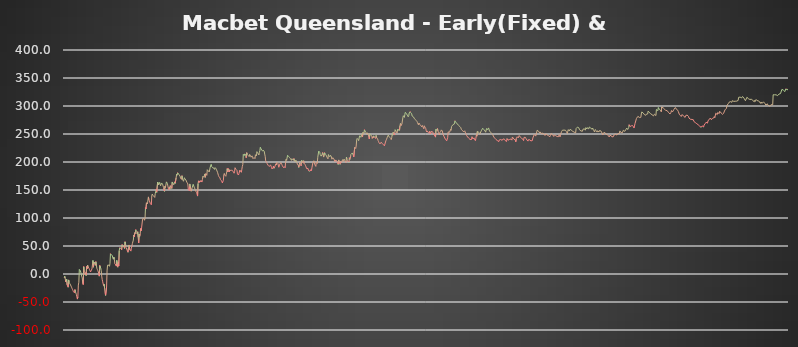
| Category | Series 0 |
|---|---|
| 0 | -7 |
| 1 | -4 |
| 2 | -8 |
| 3 | -14 |
| 4 | -15 |
| 5 | -9.6 |
| 6 | -19.6 |
| 7 | -21.6 |
| 8 | -23.6 |
| 9 | -10.6 |
| 10 | -14.6 |
| 11 | -16.6 |
| 12 | -17.6 |
| 13 | -19.6 |
| 14 | -21.6 |
| 15 | -23.6 |
| 16 | -25.6 |
| 17 | -27.6 |
| 18 | -29.6 |
| 19 | -31.6 |
| 20 | -32.6 |
| 21 | -33.6 |
| 22 | -27.8 |
| 23 | -31.8 |
| 24 | -32.8 |
| 25 | -36.8 |
| 26 | -40.8 |
| 27 | -44.8 |
| 28 | -41.2 |
| 29 | -19.84 |
| 30 | -14.84 |
| 31 | 8.16 |
| 32 | 7.16 |
| 33 | 6.16 |
| 34 | 5.16 |
| 35 | 0.16 |
| 36 | -4.84 |
| 37 | -6.84 |
| 38 | -16.84 |
| 39 | -18.84 |
| 40 | 13.16 |
| 41 | 3.16 |
| 42 | 1.16 |
| 43 | -0.84 |
| 44 | 2.36 |
| 45 | -2.64 |
| 46 | 13.36 |
| 47 | 9.36 |
| 48 | 15.76 |
| 49 | 12.76 |
| 50 | 11.76 |
| 51 | 9.76 |
| 52 | 7.76 |
| 53 | 5.76 |
| 54 | 3.76 |
| 55 | 2.76 |
| 56 | 4.56 |
| 57 | 9.16 |
| 58 | 8.16 |
| 59 | 24.16 |
| 60 | 12.16 |
| 61 | 21.36 |
| 62 | 19.36 |
| 63 | 17.36 |
| 64 | 15.36 |
| 65 | 22.16 |
| 66 | 16.16 |
| 67 | 10.16 |
| 68 | 8.16 |
| 69 | 6.16 |
| 70 | 5.16 |
| 71 | 1.16 |
| 72 | -3.84 |
| 73 | 15.16 |
| 74 | 14.16 |
| 75 | 10.16 |
| 76 | 6.16 |
| 77 | -3.84 |
| 78 | -9.84 |
| 79 | -13.84 |
| 80 | -14.84 |
| 81 | -20.84 |
| 82 | -18.24 |
| 83 | -26.24 |
| 84 | -34.24 |
| 85 | -38.24 |
| 86 | -39.24 |
| 87 | -23.24 |
| 88 | 5.56 |
| 89 | 15.76 |
| 90 | 14.76 |
| 91 | 16.76 |
| 92 | 15.76 |
| 93 | 13.76 |
| 94 | 18.76 |
| 95 | 36.36 |
| 96 | 35.36 |
| 97 | 34.36 |
| 98 | 33.36 |
| 99 | 32.36 |
| 100 | 28.36 |
| 101 | 26.36 |
| 102 | 30.16 |
| 103 | 26.16 |
| 104 | 18.16 |
| 105 | 17.16 |
| 106 | 16.16 |
| 107 | 14.16 |
| 108 | 24.16 |
| 109 | 14.16 |
| 110 | 12.16 |
| 111 | 20.56 |
| 112 | 14.56 |
| 113 | 41.56 |
| 114 | 47.06 |
| 115 | 48.36 |
| 116 | 47.36 |
| 117 | 45.36 |
| 118 | 43.36 |
| 119 | 52.56 |
| 120 | 51.56 |
| 121 | 50.56 |
| 122 | 49.56 |
| 123 | 47.56 |
| 124 | 45.56 |
| 125 | 57.56 |
| 126 | 53.56 |
| 127 | 47.56 |
| 128 | 46.56 |
| 129 | 48.86 |
| 130 | 40.86 |
| 131 | 38.86 |
| 132 | 46.86 |
| 133 | 51.86 |
| 134 | 50.86 |
| 135 | 42.86 |
| 136 | 41.86 |
| 137 | 40.86 |
| 138 | 45.86 |
| 139 | 47.11 |
| 140 | 54.31 |
| 141 | 53.31 |
| 142 | 60.51 |
| 143 | 69.71 |
| 144 | 66.71 |
| 145 | 73.91 |
| 146 | 71.91 |
| 147 | 79.41 |
| 148 | 77.41 |
| 149 | 75.41 |
| 150 | 71.41 |
| 151 | 75.41 |
| 152 | 65.41 |
| 153 | 55.41 |
| 154 | 71.41 |
| 155 | 67.41 |
| 156 | 70.81 |
| 157 | 81.21 |
| 158 | 77.21 |
| 159 | 82.96 |
| 160 | 81.96 |
| 161 | 97.96 |
| 162 | 96.96 |
| 163 | 99.96 |
| 164 | 98.96 |
| 165 | 95.96 |
| 166 | 99.16 |
| 167 | 118.36 |
| 168 | 116.36 |
| 169 | 127.16 |
| 170 | 126.16 |
| 171 | 125.16 |
| 172 | 124.16 |
| 173 | 137.66 |
| 174 | 132.66 |
| 175 | 130.66 |
| 176 | 129.66 |
| 177 | 125.66 |
| 178 | 124.66 |
| 179 | 123.66 |
| 180 | 140.66 |
| 181 | 142.76 |
| 182 | 140.76 |
| 183 | 139.76 |
| 184 | 138.76 |
| 185 | 137.76 |
| 186 | 136.76 |
| 187 | 143.36 |
| 188 | 142.36 |
| 189 | 150.86 |
| 190 | 145.86 |
| 191 | 144.86 |
| 192 | 164.06 |
| 193 | 163.06 |
| 194 | 159.06 |
| 195 | 158.06 |
| 196 | 163.56 |
| 197 | 162.56 |
| 198 | 157.56 |
| 199 | 156.56 |
| 200 | 162.56 |
| 201 | 161.56 |
| 202 | 160.56 |
| 203 | 159.56 |
| 204 | 154.56 |
| 205 | 149.56 |
| 206 | 147.56 |
| 207 | 156.56 |
| 208 | 154.56 |
| 209 | 155.76 |
| 210 | 164.56 |
| 211 | 163.56 |
| 212 | 161.56 |
| 213 | 160.56 |
| 214 | 152.56 |
| 215 | 150.56 |
| 216 | 155.36 |
| 217 | 151.36 |
| 218 | 157.76 |
| 219 | 156.76 |
| 220 | 154.76 |
| 221 | 152.76 |
| 222 | 164.36 |
| 223 | 163.36 |
| 224 | 161.36 |
| 225 | 159.36 |
| 226 | 158.36 |
| 227 | 164.76 |
| 228 | 161.76 |
| 229 | 160.76 |
| 230 | 171.96 |
| 231 | 178.36 |
| 232 | 176.36 |
| 233 | 181 |
| 234 | 180 |
| 235 | 179 |
| 236 | 177 |
| 237 | 176 |
| 238 | 175 |
| 239 | 171 |
| 240 | 170 |
| 241 | 169 |
| 242 | 175.6 |
| 243 | 169.6 |
| 244 | 167.6 |
| 245 | 165.6 |
| 246 | 164.6 |
| 247 | 171.85 |
| 248 | 169.85 |
| 249 | 168.85 |
| 250 | 167.85 |
| 251 | 166.85 |
| 252 | 163.85 |
| 253 | 162.85 |
| 254 | 160.85 |
| 255 | 150.85 |
| 256 | 149.85 |
| 257 | 148.85 |
| 258 | 160.85 |
| 259 | 159.85 |
| 260 | 151.85 |
| 261 | 147.85 |
| 262 | 151.45 |
| 263 | 154.15 |
| 264 | 153.15 |
| 265 | 160.15 |
| 266 | 159.15 |
| 267 | 155.15 |
| 268 | 154.15 |
| 269 | 151.15 |
| 270 | 148.15 |
| 271 | 147.15 |
| 272 | 146.15 |
| 273 | 145.15 |
| 274 | 139.15 |
| 275 | 161.15 |
| 276 | 166.35 |
| 277 | 163.35 |
| 278 | 166.2 |
| 279 | 164.2 |
| 280 | 163.2 |
| 281 | 167.2 |
| 282 | 166.2 |
| 283 | 164.2 |
| 284 | 168.7 |
| 285 | 174.7 |
| 286 | 173.7 |
| 287 | 172.7 |
| 288 | 171.7 |
| 289 | 178.7 |
| 290 | 172.7 |
| 291 | 179.2 |
| 292 | 178.2 |
| 293 | 176.2 |
| 294 | 186.2 |
| 295 | 185.2 |
| 296 | 184.2 |
| 297 | 183.2 |
| 298 | 182.2 |
| 299 | 181.2 |
| 300 | 190.8 |
| 301 | 189.8 |
| 302 | 195.8 |
| 303 | 191.8 |
| 304 | 190.8 |
| 305 | 189.8 |
| 306 | 190.75 |
| 307 | 189.75 |
| 308 | 188.75 |
| 309 | 186.75 |
| 310 | 189.95 |
| 311 | 188.95 |
| 312 | 187.95 |
| 313 | 185.95 |
| 314 | 187.73 |
| 315 | 181.73 |
| 316 | 180.73 |
| 317 | 175.73 |
| 318 | 173.73 |
| 319 | 172.73 |
| 320 | 171.73 |
| 321 | 168.73 |
| 322 | 167.73 |
| 323 | 166.73 |
| 324 | 164.73 |
| 325 | 162.73 |
| 326 | 161.73 |
| 327 | 167.23 |
| 328 | 177.23 |
| 329 | 179.53 |
| 330 | 176.53 |
| 331 | 175.53 |
| 332 | 174.53 |
| 333 | 178.13 |
| 334 | 182.53 |
| 335 | 188.33 |
| 336 | 182.33 |
| 337 | 188.29 |
| 338 | 186.29 |
| 339 | 182.29 |
| 340 | 186.09 |
| 341 | 185.09 |
| 342 | 184.09 |
| 343 | 183.09 |
| 344 | 185.99 |
| 345 | 184.99 |
| 346 | 183.99 |
| 347 | 182.99 |
| 348 | 181.99 |
| 349 | 179.99 |
| 350 | 182.59 |
| 351 | 189.79 |
| 352 | 188.79 |
| 353 | 186.79 |
| 354 | 185.79 |
| 355 | 184.79 |
| 356 | 178.79 |
| 357 | 177.79 |
| 358 | 176.79 |
| 359 | 179.34 |
| 360 | 178.34 |
| 361 | 185.59 |
| 362 | 183.59 |
| 363 | 182.59 |
| 364 | 181.59 |
| 365 | 187.09 |
| 366 | 192.19 |
| 367 | 195.59 |
| 368 | 213.59 |
| 369 | 212.59 |
| 370 | 211.59 |
| 371 | 214.59 |
| 372 | 213.59 |
| 373 | 212.59 |
| 374 | 207.59 |
| 375 | 216.59 |
| 376 | 213.59 |
| 377 | 212.59 |
| 378 | 211.59 |
| 379 | 210.59 |
| 380 | 209.59 |
| 381 | 213.59 |
| 382 | 212.59 |
| 383 | 210.59 |
| 384 | 208.59 |
| 385 | 207.59 |
| 386 | 210.99 |
| 387 | 207.99 |
| 388 | 205.99 |
| 389 | 204.99 |
| 390 | 207.99 |
| 391 | 206.99 |
| 392 | 205.99 |
| 393 | 212.99 |
| 394 | 211.99 |
| 395 | 210.99 |
| 396 | 218.49 |
| 397 | 216.49 |
| 398 | 215.49 |
| 399 | 214.49 |
| 400 | 212.49 |
| 401 | 217.49 |
| 402 | 220.29 |
| 403 | 226.29 |
| 404 | 224.29 |
| 405 | 223.29 |
| 406 | 221.29 |
| 407 | 220.29 |
| 408 | 219.29 |
| 409 | 221.09 |
| 410 | 220.09 |
| 411 | 219.09 |
| 412 | 214.09 |
| 413 | 210.09 |
| 414 | 202.09 |
| 415 | 201.09 |
| 416 | 199.09 |
| 417 | 197.09 |
| 418 | 196.09 |
| 419 | 194.09 |
| 420 | 193.09 |
| 421 | 192.09 |
| 422 | 191.09 |
| 423 | 192.59 |
| 424 | 194.59 |
| 425 | 192.59 |
| 426 | 190.59 |
| 427 | 187.59 |
| 428 | 186.59 |
| 429 | 189.79 |
| 430 | 192.79 |
| 431 | 188.79 |
| 432 | 187.79 |
| 433 | 191.99 |
| 434 | 190.99 |
| 435 | 196.79 |
| 436 | 194.79 |
| 437 | 199.59 |
| 438 | 198.59 |
| 439 | 197.59 |
| 440 | 196.59 |
| 441 | 190.59 |
| 442 | 189.59 |
| 443 | 196.09 |
| 444 | 195.09 |
| 445 | 198.89 |
| 446 | 197.89 |
| 447 | 195.89 |
| 448 | 193.89 |
| 449 | 191.89 |
| 450 | 190.89 |
| 451 | 189.89 |
| 452 | 191.74 |
| 453 | 190.74 |
| 454 | 189.74 |
| 455 | 200.94 |
| 456 | 204.94 |
| 457 | 202.94 |
| 458 | 201.94 |
| 459 | 211.94 |
| 460 | 210.94 |
| 461 | 209.94 |
| 462 | 208.94 |
| 463 | 207.94 |
| 464 | 206.94 |
| 465 | 205.94 |
| 466 | 204.94 |
| 467 | 202.94 |
| 468 | 205.94 |
| 469 | 204.94 |
| 470 | 207.19 |
| 471 | 203.19 |
| 472 | 206.19 |
| 473 | 202.19 |
| 474 | 201.19 |
| 475 | 200.19 |
| 476 | 203.39 |
| 477 | 201.39 |
| 478 | 199.39 |
| 479 | 196.39 |
| 480 | 195.39 |
| 481 | 194.39 |
| 482 | 190.39 |
| 483 | 194.89 |
| 484 | 198.89 |
| 485 | 195.89 |
| 486 | 194.89 |
| 487 | 192.89 |
| 488 | 202.89 |
| 489 | 200.89 |
| 490 | 199.89 |
| 491 | 198.89 |
| 492 | 202.29 |
| 493 | 197.29 |
| 494 | 196.29 |
| 495 | 195.29 |
| 496 | 193.29 |
| 497 | 191.29 |
| 498 | 188.29 |
| 499 | 187.29 |
| 500 | 189.49 |
| 501 | 188.49 |
| 502 | 184.49 |
| 503 | 183.49 |
| 504 | 184.54 |
| 505 | 183.54 |
| 506 | 183.04 |
| 507 | 186.49 |
| 508 | 184.49 |
| 509 | 189.69 |
| 510 | 188.69 |
| 511 | 198.69 |
| 512 | 197.69 |
| 513 | 202.19 |
| 514 | 200.19 |
| 515 | 195.19 |
| 516 | 194.19 |
| 517 | 192.19 |
| 518 | 199.69 |
| 519 | 201.44 |
| 520 | 197.44 |
| 521 | 208.44 |
| 522 | 207.44 |
| 523 | 219.44 |
| 524 | 218.44 |
| 525 | 217.44 |
| 526 | 213.44 |
| 527 | 212.44 |
| 528 | 210.44 |
| 529 | 209.44 |
| 530 | 213.64 |
| 531 | 216.84 |
| 532 | 212.84 |
| 533 | 208.84 |
| 534 | 207.84 |
| 535 | 216.66 |
| 536 | 215.66 |
| 537 | 213.66 |
| 538 | 212.66 |
| 539 | 210.66 |
| 540 | 208.66 |
| 541 | 207.66 |
| 542 | 205.66 |
| 543 | 213.26 |
| 544 | 211.26 |
| 545 | 210.26 |
| 546 | 209.26 |
| 547 | 212.06 |
| 548 | 211.06 |
| 549 | 210.06 |
| 550 | 205.06 |
| 551 | 204.06 |
| 552 | 207.66 |
| 553 | 206.66 |
| 554 | 205.66 |
| 555 | 203.66 |
| 556 | 200.66 |
| 557 | 199.66 |
| 558 | 203.66 |
| 559 | 202.66 |
| 560 | 201.66 |
| 561 | 200.66 |
| 562 | 197.66 |
| 563 | 195.66 |
| 564 | 203.66 |
| 565 | 199.66 |
| 566 | 197.66 |
| 567 | 195.66 |
| 568 | 201.16 |
| 569 | 200.16 |
| 570 | 199.16 |
| 571 | 198.16 |
| 572 | 204.16 |
| 573 | 203.16 |
| 574 | 201.16 |
| 575 | 205.16 |
| 576 | 204.16 |
| 577 | 202.16 |
| 578 | 200.66 |
| 579 | 199.16 |
| 580 | 208.76 |
| 581 | 204.76 |
| 582 | 202.76 |
| 583 | 204.26 |
| 584 | 203.26 |
| 585 | 199.26 |
| 586 | 207.66 |
| 587 | 204.66 |
| 588 | 206.61 |
| 589 | 213.41 |
| 590 | 212.41 |
| 591 | 214.71 |
| 592 | 216.16 |
| 593 | 215.16 |
| 594 | 212.16 |
| 595 | 209.16 |
| 596 | 208.16 |
| 597 | 226.16 |
| 598 | 225.16 |
| 599 | 224.16 |
| 600 | 228.56 |
| 601 | 239.56 |
| 602 | 242.06 |
| 603 | 241.06 |
| 604 | 240.06 |
| 605 | 238.06 |
| 606 | 237.06 |
| 607 | 246.66 |
| 608 | 245.66 |
| 609 | 245.16 |
| 610 | 244.16 |
| 611 | 249.96 |
| 612 | 248.96 |
| 613 | 244.96 |
| 614 | 252.96 |
| 615 | 251.96 |
| 616 | 250.96 |
| 617 | 257.76 |
| 618 | 255.76 |
| 619 | 254.76 |
| 620 | 252.76 |
| 621 | 251.76 |
| 622 | 249.76 |
| 623 | 252.16 |
| 624 | 250.16 |
| 625 | 248.16 |
| 626 | 247.16 |
| 627 | 241.16 |
| 628 | 250.16 |
| 629 | 249.16 |
| 630 | 248.16 |
| 631 | 247.16 |
| 632 | 246.16 |
| 633 | 242.16 |
| 634 | 244.96 |
| 635 | 242.96 |
| 636 | 246.76 |
| 637 | 245.76 |
| 638 | 243.76 |
| 639 | 243.96 |
| 640 | 241.96 |
| 641 | 247.36 |
| 642 | 243.36 |
| 643 | 242.36 |
| 644 | 241.36 |
| 645 | 238.36 |
| 646 | 236.36 |
| 647 | 234.36 |
| 648 | 233.36 |
| 649 | 232.36 |
| 650 | 231.36 |
| 651 | 235.16 |
| 652 | 234.16 |
| 653 | 234.91 |
| 654 | 232.91 |
| 655 | 231.91 |
| 656 | 230.91 |
| 657 | 229.91 |
| 658 | 228.91 |
| 659 | 227.91 |
| 660 | 230.41 |
| 661 | 237.91 |
| 662 | 239.71 |
| 663 | 238.71 |
| 664 | 244.21 |
| 665 | 243.21 |
| 666 | 248.01 |
| 667 | 246.01 |
| 668 | 245.01 |
| 669 | 244.01 |
| 670 | 243.01 |
| 671 | 242.01 |
| 672 | 240.01 |
| 673 | 243.21 |
| 674 | 249.71 |
| 675 | 247.71 |
| 676 | 253.11 |
| 677 | 250.11 |
| 678 | 249.11 |
| 679 | 248.11 |
| 680 | 257.71 |
| 681 | 256.71 |
| 682 | 254.71 |
| 683 | 253.71 |
| 684 | 251.71 |
| 685 | 258.11 |
| 686 | 256.11 |
| 687 | 255.11 |
| 688 | 258.61 |
| 689 | 256.61 |
| 690 | 264.86 |
| 691 | 268.86 |
| 692 | 264.86 |
| 693 | 263.86 |
| 694 | 267.86 |
| 695 | 266.86 |
| 696 | 279.86 |
| 697 | 282.61 |
| 698 | 281.61 |
| 699 | 279.61 |
| 700 | 285.11 |
| 701 | 288.71 |
| 702 | 287.71 |
| 703 | 286.71 |
| 704 | 285.71 |
| 705 | 283.71 |
| 706 | 282.71 |
| 707 | 280.71 |
| 708 | 282.86 |
| 709 | 287.585 |
| 710 | 286.085 |
| 711 | 290.085 |
| 712 | 288.085 |
| 713 | 287.085 |
| 714 | 286.085 |
| 715 | 282.085 |
| 716 | 280.585 |
| 717 | 282.285 |
| 718 | 280.285 |
| 719 | 278.285 |
| 720 | 277.285 |
| 721 | 276.285 |
| 722 | 275.285 |
| 723 | 274.285 |
| 724 | 273.285 |
| 725 | 272.285 |
| 726 | 270.285 |
| 727 | 269.285 |
| 728 | 266.285 |
| 729 | 269.685 |
| 730 | 268.685 |
| 731 | 266.685 |
| 732 | 265.685 |
| 733 | 264.685 |
| 734 | 263.685 |
| 735 | 262.685 |
| 736 | 265.285 |
| 737 | 263.285 |
| 738 | 262.285 |
| 739 | 259.285 |
| 740 | 264.685 |
| 741 | 262.685 |
| 742 | 261.685 |
| 743 | 259.685 |
| 744 | 255.685 |
| 745 | 253.685 |
| 746 | 255.485 |
| 747 | 254.985 |
| 748 | 252.985 |
| 749 | 251.985 |
| 750 | 250.985 |
| 751 | 255.035 |
| 752 | 254.035 |
| 753 | 250.035 |
| 754 | 254.535 |
| 755 | 255.435 |
| 756 | 254.435 |
| 757 | 253.935 |
| 758 | 253.435 |
| 759 | 252.435 |
| 760 | 248.435 |
| 761 | 247.435 |
| 762 | 246.435 |
| 763 | 244.435 |
| 764 | 258.435 |
| 765 | 257.435 |
| 766 | 256.435 |
| 767 | 259.735 |
| 768 | 255.735 |
| 769 | 252.735 |
| 770 | 251.735 |
| 771 | 248.735 |
| 772 | 252.735 |
| 773 | 251.735 |
| 774 | 254.935 |
| 775 | 257.335 |
| 776 | 256.335 |
| 777 | 255.335 |
| 778 | 251.335 |
| 779 | 248.335 |
| 780 | 246.835 |
| 781 | 244.835 |
| 782 | 242.835 |
| 783 | 241.835 |
| 784 | 239.835 |
| 785 | 238.835 |
| 786 | 237.835 |
| 787 | 236.835 |
| 788 | 243.635 |
| 789 | 253.635 |
| 790 | 255.235 |
| 791 | 254.235 |
| 792 | 253.235 |
| 793 | 252.235 |
| 794 | 258.535 |
| 795 | 256.535 |
| 796 | 263.335 |
| 797 | 262.835 |
| 798 | 261.835 |
| 799 | 266.835 |
| 800 | 266.335 |
| 801 | 265.335 |
| 802 | 268.135 |
| 803 | 273.735 |
| 804 | 271.735 |
| 805 | 270.735 |
| 806 | 269.735 |
| 807 | 268.735 |
| 808 | 267.735 |
| 809 | 267.235 |
| 810 | 265.735 |
| 811 | 265.235 |
| 812 | 264.735 |
| 813 | 263.235 |
| 814 | 262.235 |
| 815 | 261.235 |
| 816 | 258.235 |
| 817 | 257.235 |
| 818 | 256.735 |
| 819 | 255.735 |
| 820 | 254.735 |
| 821 | 253.735 |
| 822 | 252.735 |
| 823 | 255.735 |
| 824 | 254.235 |
| 825 | 251.235 |
| 826 | 249.235 |
| 827 | 247.235 |
| 828 | 245.735 |
| 829 | 244.735 |
| 830 | 243.735 |
| 831 | 242.735 |
| 832 | 242.235 |
| 833 | 241.235 |
| 834 | 240.235 |
| 835 | 241.135 |
| 836 | 240.635 |
| 837 | 240.135 |
| 838 | 245.135 |
| 839 | 244.135 |
| 840 | 241.135 |
| 841 | 240.135 |
| 842 | 243.135 |
| 843 | 241.135 |
| 844 | 240.135 |
| 845 | 238.135 |
| 846 | 242.135 |
| 847 | 248.135 |
| 848 | 246.135 |
| 849 | 254.635 |
| 850 | 254.135 |
| 851 | 253.635 |
| 852 | 253.135 |
| 853 | 252.635 |
| 854 | 249.635 |
| 855 | 248.635 |
| 856 | 249.335 |
| 857 | 255.635 |
| 858 | 254.635 |
| 859 | 256.835 |
| 860 | 260.235 |
| 861 | 258.735 |
| 862 | 258.235 |
| 863 | 257.735 |
| 864 | 257.235 |
| 865 | 255.235 |
| 866 | 253.235 |
| 867 | 254.585 |
| 868 | 259.785 |
| 869 | 258.785 |
| 870 | 257.785 |
| 871 | 257.285 |
| 872 | 260.885 |
| 873 | 260.385 |
| 874 | 255.385 |
| 875 | 254.385 |
| 876 | 253.385 |
| 877 | 252.385 |
| 878 | 251.385 |
| 879 | 250.385 |
| 880 | 249.385 |
| 881 | 248.385 |
| 882 | 246.385 |
| 883 | 244.385 |
| 884 | 242.885 |
| 885 | 242.385 |
| 886 | 241.385 |
| 887 | 240.385 |
| 888 | 239.385 |
| 889 | 238.885 |
| 890 | 238.385 |
| 891 | 237.885 |
| 892 | 237.385 |
| 893 | 236.385 |
| 894 | 239.385 |
| 895 | 238.885 |
| 896 | 240.685 |
| 897 | 240.185 |
| 898 | 239.685 |
| 899 | 239.185 |
| 900 | 238.685 |
| 901 | 238.185 |
| 902 | 241.185 |
| 903 | 239.685 |
| 904 | 241.585 |
| 905 | 240.585 |
| 906 | 238.585 |
| 907 | 237.585 |
| 908 | 237.085 |
| 909 | 236.585 |
| 910 | 241.985 |
| 911 | 240.985 |
| 912 | 238.985 |
| 913 | 238.485 |
| 914 | 240.625 |
| 915 | 240.125 |
| 916 | 239.625 |
| 917 | 239.125 |
| 918 | 241.055 |
| 919 | 239.555 |
| 920 | 239.055 |
| 921 | 244.655 |
| 922 | 244.155 |
| 923 | 243.655 |
| 924 | 241.155 |
| 925 | 240.655 |
| 926 | 240.155 |
| 927 | 239.155 |
| 928 | 236.155 |
| 929 | 241.755 |
| 930 | 242.955 |
| 931 | 245.055 |
| 932 | 244.055 |
| 933 | 243.055 |
| 934 | 244.627 |
| 935 | 247.247 |
| 936 | 246.747 |
| 937 | 244.747 |
| 938 | 246.247 |
| 939 | 244.247 |
| 940 | 242.247 |
| 941 | 241.247 |
| 942 | 240.747 |
| 943 | 240.247 |
| 944 | 238.247 |
| 945 | 244.047 |
| 946 | 243.547 |
| 947 | 242.547 |
| 948 | 243.797 |
| 949 | 241.797 |
| 950 | 241.297 |
| 951 | 239.297 |
| 952 | 238.297 |
| 953 | 237.297 |
| 954 | 239.842 |
| 955 | 238.842 |
| 956 | 238.342 |
| 957 | 239.592 |
| 958 | 239.092 |
| 959 | 237.592 |
| 960 | 239.232 |
| 961 | 238.732 |
| 962 | 238.232 |
| 963 | 242.732 |
| 964 | 242.232 |
| 965 | 241.232 |
| 966 | 249.232 |
| 967 | 248.232 |
| 968 | 247.732 |
| 969 | 246.232 |
| 970 | 245.732 |
| 971 | 244.732 |
| 972 | 256.732 |
| 973 | 255.732 |
| 974 | 255.232 |
| 975 | 254.732 |
| 976 | 253.732 |
| 977 | 251.732 |
| 978 | 253.732 |
| 979 | 252.732 |
| 980 | 251.732 |
| 981 | 249.732 |
| 982 | 248.732 |
| 983 | 251.832 |
| 984 | 251.332 |
| 985 | 250.332 |
| 986 | 249.832 |
| 987 | 249.332 |
| 988 | 247.332 |
| 989 | 246.832 |
| 990 | 250.632 |
| 991 | 249.632 |
| 992 | 248.632 |
| 993 | 248.132 |
| 994 | 247.632 |
| 995 | 247.132 |
| 996 | 246.632 |
| 997 | 245.632 |
| 998 | 245.132 |
| 999 | 247.132 |
| 1000 | 246.132 |
| 1001 | 251.132 |
| 1002 | 250.632 |
| 1003 | 249.632 |
| 1004 | 248.132 |
| 1005 | 247.632 |
| 1006 | 245.632 |
| 1007 | 248.532 |
| 1008 | 248.032 |
| 1009 | 247.532 |
| 1010 | 247.032 |
| 1011 | 246.532 |
| 1012 | 246.032 |
| 1013 | 245.532 |
| 1014 | 245.032 |
| 1015 | 246.282 |
| 1016 | 245.282 |
| 1017 | 248.882 |
| 1018 | 246.882 |
| 1019 | 244.882 |
| 1020 | 248.882 |
| 1021 | 249.682 |
| 1022 | 254.282 |
| 1023 | 253.782 |
| 1024 | 256.782 |
| 1025 | 256.282 |
| 1026 | 257.892 |
| 1027 | 256.892 |
| 1028 | 256.392 |
| 1029 | 257.772 |
| 1030 | 256.772 |
| 1031 | 256.272 |
| 1032 | 254.272 |
| 1033 | 253.772 |
| 1034 | 250.772 |
| 1035 | 255.272 |
| 1036 | 257.772 |
| 1037 | 257.272 |
| 1038 | 255.272 |
| 1039 | 254.772 |
| 1040 | 258.772 |
| 1041 | 257.772 |
| 1042 | 256.772 |
| 1043 | 256.272 |
| 1044 | 255.772 |
| 1045 | 254.772 |
| 1046 | 254.272 |
| 1047 | 253.772 |
| 1048 | 253.272 |
| 1049 | 251.772 |
| 1050 | 252.972 |
| 1051 | 251.972 |
| 1052 | 259.772 |
| 1053 | 260.512 |
| 1054 | 258.512 |
| 1055 | 262.422 |
| 1056 | 261.422 |
| 1057 | 260.922 |
| 1058 | 260.422 |
| 1059 | 257.422 |
| 1060 | 256.422 |
| 1061 | 255.922 |
| 1062 | 255.422 |
| 1063 | 256.922 |
| 1064 | 255.922 |
| 1065 | 254.922 |
| 1066 | 258.322 |
| 1067 | 258.578 |
| 1068 | 259.832 |
| 1069 | 259.332 |
| 1070 | 258.832 |
| 1071 | 256.832 |
| 1072 | 261.407 |
| 1073 | 260.907 |
| 1074 | 258.907 |
| 1075 | 261.107 |
| 1076 | 260.107 |
| 1077 | 259.607 |
| 1078 | 259.107 |
| 1079 | 262.507 |
| 1080 | 262.007 |
| 1081 | 261.507 |
| 1082 | 260.507 |
| 1083 | 259.507 |
| 1084 | 259.007 |
| 1085 | 258.507 |
| 1086 | 260.607 |
| 1087 | 258.607 |
| 1088 | 256.607 |
| 1089 | 255.607 |
| 1090 | 253.607 |
| 1091 | 257.957 |
| 1092 | 257.457 |
| 1093 | 256.457 |
| 1094 | 255.457 |
| 1095 | 253.457 |
| 1096 | 255.657 |
| 1097 | 255.157 |
| 1098 | 254.657 |
| 1099 | 253.657 |
| 1100 | 256.252 |
| 1101 | 257.932 |
| 1102 | 256.932 |
| 1103 | 255.432 |
| 1104 | 254.932 |
| 1105 | 251.932 |
| 1106 | 251.432 |
| 1107 | 248.432 |
| 1108 | 250.682 |
| 1109 | 249.682 |
| 1110 | 253.483 |
| 1111 | 254.182 |
| 1112 | 252.182 |
| 1113 | 250.182 |
| 1114 | 249.682 |
| 1115 | 249.182 |
| 1116 | 248.682 |
| 1117 | 248.182 |
| 1118 | 247.182 |
| 1119 | 246.682 |
| 1120 | 244.682 |
| 1121 | 247.382 |
| 1122 | 246.382 |
| 1123 | 247.788 |
| 1124 | 247.288 |
| 1125 | 245.288 |
| 1126 | 246.788 |
| 1127 | 245.288 |
| 1128 | 244.788 |
| 1129 | 244.288 |
| 1130 | 248.288 |
| 1131 | 247.288 |
| 1132 | 248.788 |
| 1133 | 249.638 |
| 1134 | 249.138 |
| 1135 | 248.638 |
| 1136 | 248.138 |
| 1137 | 247.138 |
| 1138 | 250.698 |
| 1139 | 250.198 |
| 1140 | 251.652 |
| 1141 | 251.152 |
| 1142 | 255.502 |
| 1143 | 254.002 |
| 1144 | 252.502 |
| 1145 | 254.202 |
| 1146 | 252.702 |
| 1147 | 252.202 |
| 1148 | 251.202 |
| 1149 | 256.702 |
| 1150 | 256.202 |
| 1151 | 255.702 |
| 1152 | 254.702 |
| 1153 | 253.702 |
| 1154 | 257.702 |
| 1155 | 258.602 |
| 1156 | 260.502 |
| 1157 | 259.502 |
| 1158 | 258.002 |
| 1159 | 257.502 |
| 1160 | 261.502 |
| 1161 | 266.502 |
| 1162 | 264.002 |
| 1163 | 263.002 |
| 1164 | 264.277 |
| 1165 | 263.777 |
| 1166 | 263.277 |
| 1167 | 265.677 |
| 1168 | 265.177 |
| 1169 | 264.677 |
| 1170 | 262.677 |
| 1171 | 260.677 |
| 1172 | 262.277 |
| 1173 | 268.527 |
| 1174 | 267.027 |
| 1175 | 269.727 |
| 1176 | 277.727 |
| 1177 | 277.227 |
| 1178 | 276.227 |
| 1179 | 281.487 |
| 1180 | 280.487 |
| 1181 | 279.987 |
| 1182 | 279.487 |
| 1183 | 278.487 |
| 1184 | 277.987 |
| 1185 | 279.787 |
| 1186 | 285.787 |
| 1187 | 289.387 |
| 1188 | 288.387 |
| 1189 | 287.887 |
| 1190 | 287.387 |
| 1191 | 285.887 |
| 1192 | 284.887 |
| 1193 | 284.387 |
| 1194 | 283.887 |
| 1195 | 283.387 |
| 1196 | 285.187 |
| 1197 | 284.687 |
| 1198 | 286.687 |
| 1199 | 285.687 |
| 1200 | 290.887 |
| 1201 | 289.387 |
| 1202 | 288.887 |
| 1203 | 288.387 |
| 1204 | 287.387 |
| 1205 | 286.387 |
| 1206 | 285.887 |
| 1207 | 285.387 |
| 1208 | 284.387 |
| 1209 | 283.387 |
| 1210 | 282.887 |
| 1211 | 282.387 |
| 1212 | 283.687 |
| 1213 | 285.437 |
| 1214 | 284.437 |
| 1215 | 283.937 |
| 1216 | 282.937 |
| 1217 | 293.737 |
| 1218 | 292.737 |
| 1219 | 292.237 |
| 1220 | 291.737 |
| 1221 | 297.338 |
| 1222 | 296.838 |
| 1223 | 293.838 |
| 1224 | 292.838 |
| 1225 | 292.338 |
| 1226 | 291.838 |
| 1227 | 289.838 |
| 1228 | 298.338 |
| 1229 | 297.838 |
| 1230 | 296.838 |
| 1231 | 296.588 |
| 1232 | 296.088 |
| 1233 | 295.088 |
| 1234 | 294.088 |
| 1235 | 293.088 |
| 1236 | 292.088 |
| 1237 | 291.088 |
| 1238 | 292.787 |
| 1239 | 291.787 |
| 1240 | 290.787 |
| 1241 | 290.287 |
| 1242 | 288.287 |
| 1243 | 287.287 |
| 1244 | 286.787 |
| 1245 | 285.787 |
| 1246 | 285.287 |
| 1247 | 288.687 |
| 1248 | 291.887 |
| 1249 | 290.887 |
| 1250 | 289.387 |
| 1251 | 288.887 |
| 1252 | 288.387 |
| 1253 | 293.787 |
| 1254 | 293.287 |
| 1255 | 292.787 |
| 1256 | 297.287 |
| 1257 | 296.787 |
| 1258 | 294.287 |
| 1259 | 293.787 |
| 1260 | 293.287 |
| 1261 | 292.287 |
| 1262 | 290.287 |
| 1263 | 289.287 |
| 1264 | 285.287 |
| 1265 | 284.787 |
| 1266 | 283.287 |
| 1267 | 282.287 |
| 1268 | 281.287 |
| 1269 | 280.287 |
| 1270 | 284.737 |
| 1271 | 284.237 |
| 1272 | 283.737 |
| 1273 | 281.737 |
| 1274 | 281.237 |
| 1275 | 280.737 |
| 1276 | 279.737 |
| 1277 | 282.737 |
| 1278 | 282.237 |
| 1279 | 281.237 |
| 1280 | 283.822 |
| 1281 | 283.322 |
| 1282 | 282.322 |
| 1283 | 281.322 |
| 1284 | 278.322 |
| 1285 | 277.822 |
| 1286 | 277.322 |
| 1287 | 276.322 |
| 1288 | 277.942 |
| 1289 | 276.942 |
| 1290 | 275.942 |
| 1291 | 274.942 |
| 1292 | 276.387 |
| 1293 | 275.387 |
| 1294 | 272.387 |
| 1295 | 271.387 |
| 1296 | 270.887 |
| 1297 | 270.387 |
| 1298 | 269.887 |
| 1299 | 269.387 |
| 1300 | 268.387 |
| 1301 | 267.387 |
| 1302 | 266.887 |
| 1303 | 266.387 |
| 1304 | 265.387 |
| 1305 | 264.887 |
| 1306 | 263.887 |
| 1307 | 262.887 |
| 1308 | 262.387 |
| 1309 | 261.887 |
| 1310 | 260.887 |
| 1311 | 264.487 |
| 1312 | 263.987 |
| 1313 | 263.487 |
| 1314 | 262.487 |
| 1315 | 266.087 |
| 1316 | 265.087 |
| 1317 | 268.227 |
| 1318 | 267.227 |
| 1319 | 270.927 |
| 1320 | 270.427 |
| 1321 | 269.927 |
| 1322 | 269.427 |
| 1323 | 273.327 |
| 1324 | 272.827 |
| 1325 | 272.327 |
| 1326 | 276.727 |
| 1327 | 275.727 |
| 1328 | 278.527 |
| 1329 | 277.527 |
| 1330 | 275.527 |
| 1331 | 275.027 |
| 1332 | 277.777 |
| 1333 | 277.277 |
| 1334 | 276.277 |
| 1335 | 278.867 |
| 1336 | 281.072 |
| 1337 | 279.072 |
| 1338 | 278.072 |
| 1339 | 287.072 |
| 1340 | 286.072 |
| 1341 | 285.572 |
| 1342 | 284.572 |
| 1343 | 288.372 |
| 1344 | 287.872 |
| 1345 | 287.372 |
| 1346 | 286.372 |
| 1347 | 290.572 |
| 1348 | 289.572 |
| 1349 | 289.072 |
| 1350 | 287.572 |
| 1351 | 286.572 |
| 1352 | 286.072 |
| 1353 | 285.072 |
| 1354 | 284.822 |
| 1355 | 286.942 |
| 1356 | 286.442 |
| 1357 | 285.942 |
| 1358 | 293.142 |
| 1359 | 292.642 |
| 1360 | 292.142 |
| 1361 | 295.892 |
| 1362 | 301.092 |
| 1363 | 302.792 |
| 1364 | 301.792 |
| 1365 | 304.592 |
| 1366 | 306.392 |
| 1367 | 305.892 |
| 1368 | 305.392 |
| 1369 | 307.862 |
| 1370 | 307.362 |
| 1371 | 306.862 |
| 1372 | 306.612 |
| 1373 | 309.512 |
| 1374 | 309.012 |
| 1375 | 308.762 |
| 1376 | 308.262 |
| 1377 | 307.762 |
| 1378 | 308.962 |
| 1379 | 308.462 |
| 1380 | 307.962 |
| 1381 | 307.462 |
| 1382 | 308.692 |
| 1383 | 308.192 |
| 1384 | 310.442 |
| 1385 | 309.942 |
| 1386 | 315.442 |
| 1387 | 316.692 |
| 1388 | 316.442 |
| 1389 | 315.942 |
| 1390 | 315.442 |
| 1391 | 314.942 |
| 1392 | 314.442 |
| 1393 | 313.942 |
| 1394 | 316.942 |
| 1395 | 316.442 |
| 1396 | 315.942 |
| 1397 | 313.942 |
| 1398 | 312.942 |
| 1399 | 312.442 |
| 1400 | 309.442 |
| 1401 | 308.942 |
| 1402 | 307.942 |
| 1403 | 315.562 |
| 1404 | 317.162 |
| 1405 | 315.162 |
| 1406 | 313.162 |
| 1407 | 312.662 |
| 1408 | 312.162 |
| 1409 | 311.662 |
| 1410 | 311.162 |
| 1411 | 310.662 |
| 1412 | 312.062 |
| 1413 | 311.562 |
| 1414 | 311.062 |
| 1415 | 310.062 |
| 1416 | 309.062 |
| 1417 | 308.562 |
| 1418 | 307.562 |
| 1419 | 310.057 |
| 1420 | 308.057 |
| 1421 | 307.557 |
| 1422 | 311.557 |
| 1423 | 311.057 |
| 1424 | 309.557 |
| 1425 | 308.557 |
| 1426 | 309.707 |
| 1427 | 309.207 |
| 1428 | 307.707 |
| 1429 | 307.207 |
| 1430 | 306.707 |
| 1431 | 304.707 |
| 1432 | 307.207 |
| 1433 | 306.707 |
| 1434 | 304.707 |
| 1435 | 303.707 |
| 1436 | 303.207 |
| 1437 | 307.457 |
| 1438 | 306.957 |
| 1439 | 305.957 |
| 1440 | 304.457 |
| 1441 | 303.957 |
| 1442 | 301.457 |
| 1443 | 300.957 |
| 1444 | 300.457 |
| 1445 | 303.857 |
| 1446 | 301.857 |
| 1447 | 300.857 |
| 1448 | 300.357 |
| 1449 | 299.857 |
| 1450 | 298.857 |
| 1451 | 298.357 |
| 1452 | 300.707 |
| 1453 | 302.607 |
| 1454 | 302.107 |
| 1455 | 303.607 |
| 1456 | 302.107 |
| 1457 | 320.107 |
| 1458 | 319.607 |
| 1459 | 320.507 |
| 1460 | 320.007 |
| 1461 | 321.502 |
| 1462 | 321.002 |
| 1463 | 320.002 |
| 1464 | 319.502 |
| 1465 | 319.002 |
| 1466 | 318.502 |
| 1467 | 317.502 |
| 1468 | 319.442 |
| 1469 | 321.342 |
| 1470 | 320.342 |
| 1471 | 322.672 |
| 1472 | 322.172 |
| 1473 | 322.747 |
| 1474 | 321.747 |
| 1475 | 329.747 |
| 1476 | 329.247 |
| 1477 | 328.747 |
| 1478 | 328.247 |
| 1479 | 327.747 |
| 1480 | 327.247 |
| 1481 | 325.747 |
| 1482 | 324.747 |
| 1483 | 330.747 |
| 1484 | 330.247 |
| 1485 | 329.247 |
| 1486 | 328.747 |
| 1487 | 328.247 |
| 1488 | 331.122 |
| 1489 | 332.072 |